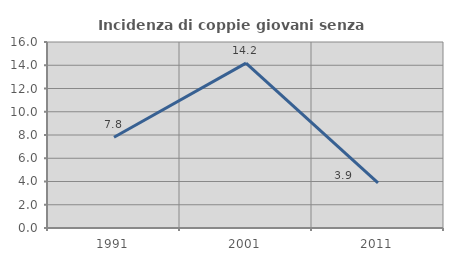
| Category | Incidenza di coppie giovani senza figli |
|---|---|
| 1991.0 | 7.803 |
| 2001.0 | 14.187 |
| 2011.0 | 3.873 |